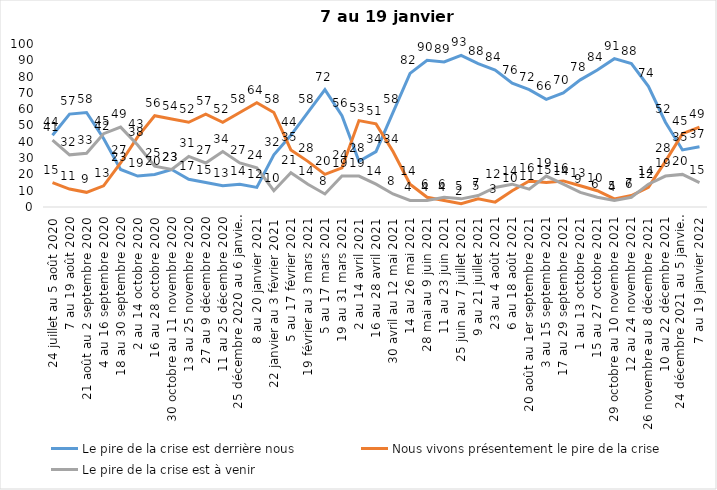
| Category | Le pire de la crise est derrière nous | Nous vivons présentement le pire de la crise | Le pire de la crise est à venir |
|---|---|---|---|
| 24 juillet au 5 août 2020 | 44 | 15 | 41 |
| 7 au 19 août 2020 | 57 | 11 | 32 |
| 21 août au 2 septembre 2020 | 58 | 9 | 33 |
| 4 au 16 septembre 2020 | 42 | 13 | 45 |
| 18 au 30 septembre 2020 | 23 | 27 | 49 |
| 2 au 14 octobre 2020 | 19 | 43 | 38 |
| 16 au 28 octobre 2020 | 20 | 56 | 25 |
| 30 octobre au 11 novembre 2020 | 23 | 54 | 23 |
| 13 au 25 novembre 2020 | 17 | 52 | 31 |
| 27 au 9 décembre 2020 | 15 | 57 | 27 |
| 11 au 25 décembre 2020 | 13 | 52 | 34 |
| 25 décembre 2020 au 6 janvier 2021 | 14 | 58 | 27 |
| 8 au 20 janvier 2021 | 12 | 64 | 24 |
| 22 janvier au 3 février 2021 | 32 | 58 | 10 |
| 5 au 17 février 2021 | 44 | 35 | 21 |
| 19 février au 3 mars 2021 | 58 | 28 | 14 |
| 5 au 17 mars 2021 | 72 | 20 | 8 |
| 19 au 31 mars 2021 | 56 | 24 | 19 |
| 2 au 14 avril 2021 | 28 | 53 | 19 |
| 16 au 28 avril 2021 | 34 | 51 | 14 |
| 30 avril au 12 mai 2021 | 58 | 34 | 8 |
| 14 au 26 mai 2021 | 82 | 14 | 4 |
| 28 mai au 9 juin 2021 | 90 | 6 | 4 |
| 11 au 23 juin 2021 | 89 | 4 | 6 |
| 25 juin au 7 juillet 2021 | 93 | 2 | 5 |
| 9 au 21 juillet 2021 | 88 | 5 | 7 |
| 23 au 4 août 2021 | 84 | 3 | 12 |
| 6 au 18 août 2021 | 76 | 10 | 14 |
| 20 août au 1er septembre 2021 | 72 | 16 | 11 |
| 3 au 15 septembre 2021 | 66 | 15 | 19 |
| 17 au 29 septembre 2021 | 70 | 16 | 14 |
| 1 au 13 octobre 2021 | 78 | 13 | 9 |
| 15 au 27 octobre 2021 | 84 | 10 | 6 |
| 29 octobre au 10 novembre 2021 | 91 | 5 | 4 |
| 12 au 24 novembre 2021 | 88 | 7 | 6 |
| 26 novembre au 8 décembre 2021 | 74 | 12 | 14 |
| 10 au 22 décembre 2021 | 52 | 28 | 19 |
| 24 décembre 2021 au 5 janvier 2022 2022 | 35 | 45 | 20 |
| 7 au 19 janvier 2022 | 37 | 49 | 15 |